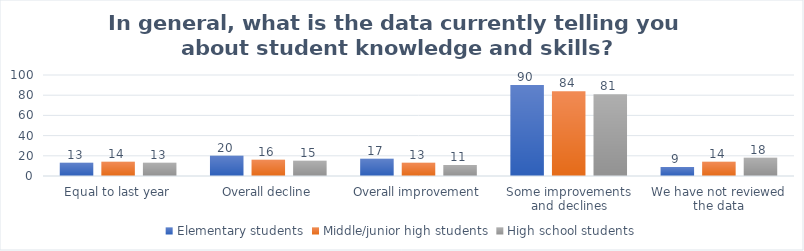
| Category | Elementary students | Middle/junior high students | High school students |
|---|---|---|---|
| Equal to last year | 13 | 14 | 13 |
| Overall decline | 20 | 16 | 15 |
| Overall improvement | 17 | 13 | 11 |
| Some improvements and declines | 90 | 84 | 81 |
| We have not reviewed the data | 9 | 14 | 18 |